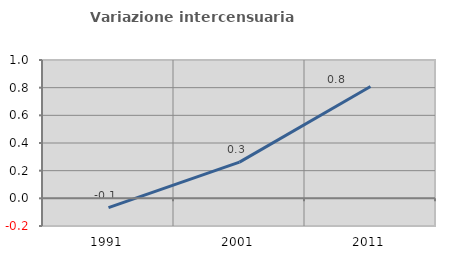
| Category | Variazione intercensuaria annua |
|---|---|
| 1991.0 | -0.067 |
| 2001.0 | 0.261 |
| 2011.0 | 0.809 |